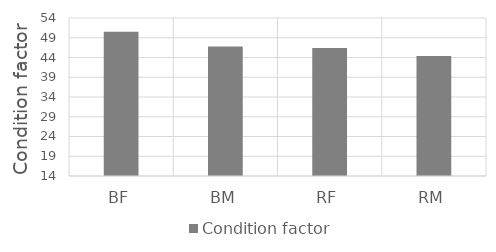
| Category | Condition factor |
|---|---|
| BF | 50.5 |
| BM | 46.8 |
| RF | 46.4 |
| RM | 44.4 |